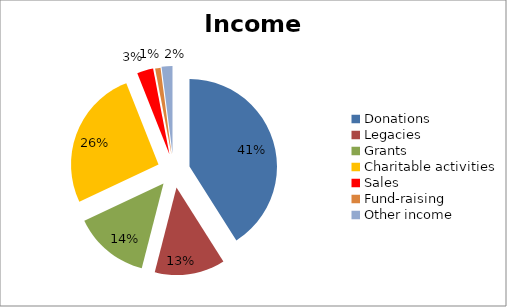
| Category | Series 0 |
|---|---|
| Donations | 0.41 |
| Legacies | 0.13 |
| Grants | 0.14 |
| Charitable activities | 0.26 |
| Sales | 0.03 |
| Fund-raising  | 0.01 |
| Other income | 0.02 |